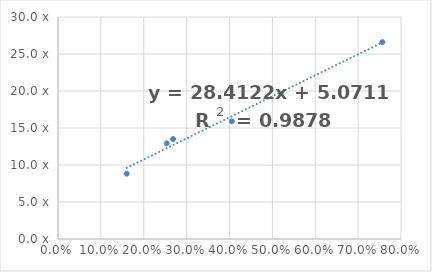
| Category | x R Ex |
|---|---|
| 0.2684354817761019 | 13.507 |
| 0.7565596655781606 | 26.602 |
| 0.40547220274043716 | 15.905 |
| 0.2535663410560174 | 12.914 |
| 0.16023870223064285 | 8.827 |